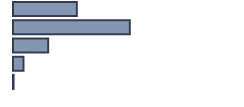
| Category | Series 0 |
|---|---|
| 0 | 28.116 |
| 1 | 51.456 |
| 2 | 15.494 |
| 3 | 4.679 |
| 4 | 0.256 |